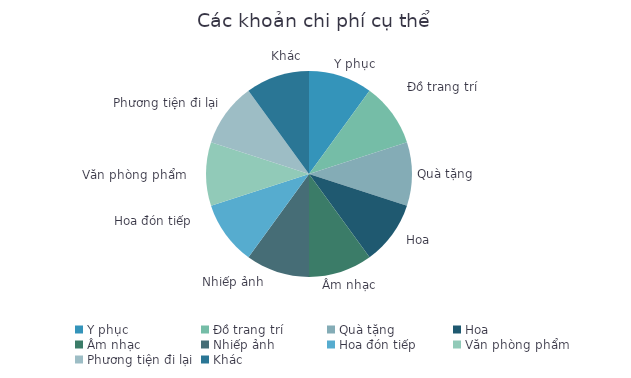
| Category | Số tiền |
|---|---|
| Y phục | 1 |
| Đồ trang trí | 1 |
| Quà tặng | 1 |
| Hoa | 1 |
| Âm nhạc | 1 |
| Nhiếp ảnh | 1 |
| Hoa đón tiếp | 1 |
| Văn phòng phẩm | 1 |
| Phương tiện đi lại | 1 |
| Khác | 1 |